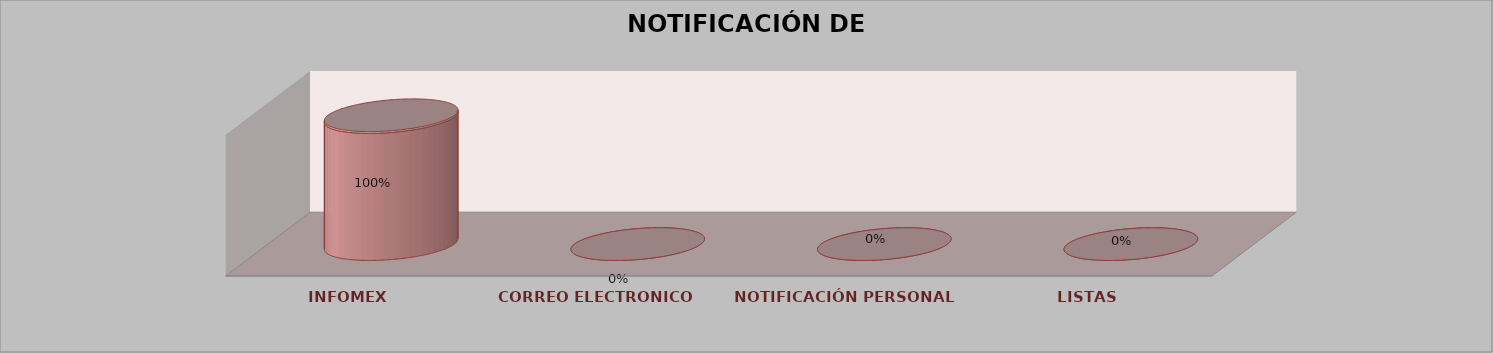
| Category | Series 0 | Series 1 | Series 2 | Series 3 | Series 4 |
|---|---|---|---|---|---|
| INFOMEX |  |  |  | 72 | 1 |
| CORREO ELECTRONICO |  |  |  | 0 | 0 |
| NOTIFICACIÓN PERSONAL |  |  |  | 0 | 0 |
| LISTAS |  |  |  | 0 | 0 |